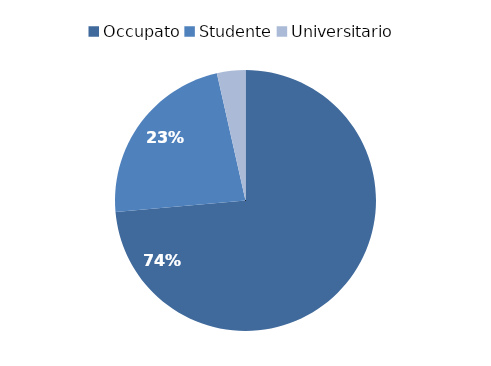
| Category | numerosità |
|---|---|
| Occupato | 73.593 |
| Studente | 22.887 |
| Universitario | 3.52 |